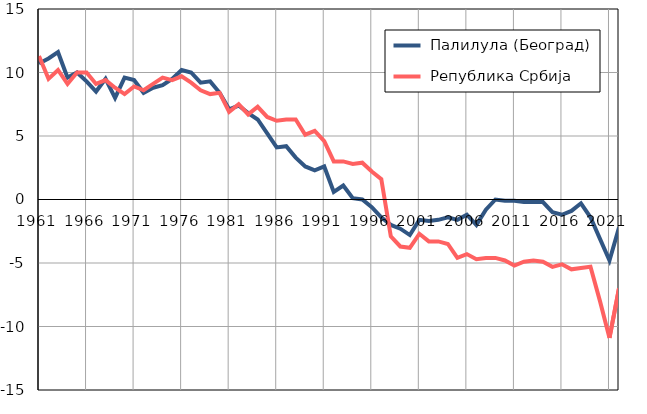
| Category |  Палилула (Београд) |  Република Србија |
|---|---|---|
| 1961.0 | 10.7 | 11.3 |
| 1962.0 | 11.1 | 9.5 |
| 1963.0 | 11.6 | 10.2 |
| 1964.0 | 9.6 | 9.1 |
| 1965.0 | 10 | 10 |
| 1966.0 | 9.3 | 10 |
| 1967.0 | 8.5 | 9.1 |
| 1968.0 | 9.5 | 9.4 |
| 1969.0 | 8 | 8.8 |
| 1970.0 | 9.6 | 8.3 |
| 1971.0 | 9.4 | 8.9 |
| 1972.0 | 8.4 | 8.6 |
| 1973.0 | 8.8 | 9.1 |
| 1974.0 | 9 | 9.6 |
| 1975.0 | 9.5 | 9.4 |
| 1976.0 | 10.2 | 9.7 |
| 1977.0 | 10 | 9.2 |
| 1978.0 | 9.2 | 8.6 |
| 1979.0 | 9.3 | 8.3 |
| 1980.0 | 8.4 | 8.4 |
| 1981.0 | 7.1 | 6.9 |
| 1982.0 | 7.4 | 7.5 |
| 1983.0 | 6.8 | 6.7 |
| 1984.0 | 6.3 | 7.3 |
| 1985.0 | 5.2 | 6.5 |
| 1986.0 | 4.1 | 6.2 |
| 1987.0 | 4.2 | 6.3 |
| 1988.0 | 3.3 | 6.3 |
| 1989.0 | 2.6 | 5.1 |
| 1990.0 | 2.3 | 5.4 |
| 1991.0 | 2.6 | 4.6 |
| 1992.0 | 0.6 | 3 |
| 1993.0 | 1.1 | 3 |
| 1994.0 | 0.1 | 2.8 |
| 1995.0 | 0 | 2.9 |
| 1996.0 | -0.6 | 2.2 |
| 1997.0 | -1.4 | 1.6 |
| 1998.0 | -2 | -2.9 |
| 1999.0 | -2.3 | -3.7 |
| 2000.0 | -2.8 | -3.8 |
| 2001.0 | -1.6 | -2.7 |
| 2002.0 | -1.7 | -3.3 |
| 2003.0 | -1.6 | -3.3 |
| 2004.0 | -1.4 | -3.5 |
| 2005.0 | -1.6 | -4.6 |
| 2006.0 | -1.2 | -4.3 |
| 2007.0 | -2 | -4.7 |
| 2008.0 | -0.8 | -4.6 |
| 2009.0 | 0 | -4.6 |
| 2010.0 | -0.1 | -4.8 |
| 2011.0 | -0.1 | -5.2 |
| 2012.0 | -0.2 | -4.9 |
| 2013.0 | -0.2 | -4.8 |
| 2014.0 | -0.2 | -4.9 |
| 2015.0 | -1 | -5.3 |
| 2016.0 | -1.2 | -5.1 |
| 2017.0 | -0.9 | -5.5 |
| 2018.0 | -0.3 | -5.4 |
| 2019.0 | -1.4 | -5.3 |
| 2020.0 | -3.1 | -8 |
| 2021.0 | -4.8 | -10.9 |
| 2022.0 | -2.2 | -7 |